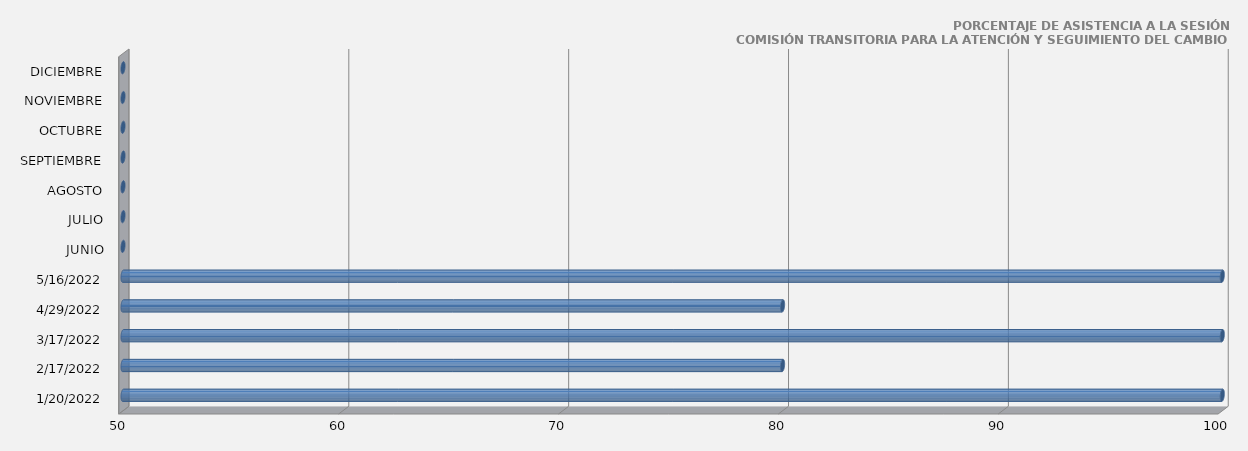
| Category | 20/01/2022 |
|---|---|
| 20/01/2022 | 100 |
| 17/02/2022 | 80 |
| 17/03/2022 | 100 |
| 29/04/2022 | 80 |
| 16/05/2022 | 100 |
| JUNIO | 0 |
| JULIO | 0 |
| AGOSTO | 0 |
| SEPTIEMBRE | 0 |
| OCTUBRE | 0 |
| NOVIEMBRE | 0 |
| DICIEMBRE | 0 |